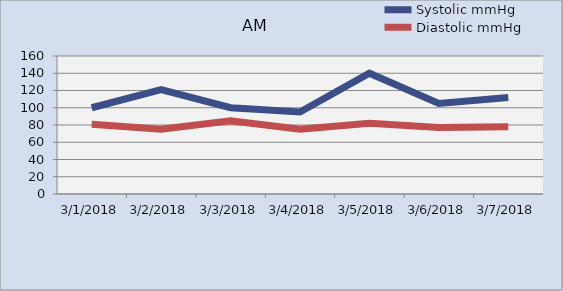
| Category | Systolic mmHg | Diastolic mmHg |
|---|---|---|
| 01/03/2018 | 100 | 81 |
| 02/03/2018 | 121 | 75 |
| 03/03/2018 | 100 | 85 |
| 04/03/2018 | 95 | 75 |
| 05/03/2018 | 140 | 82 |
| 06/03/2018 | 105 | 77 |
| 07/03/2018 | 112 | 78 |